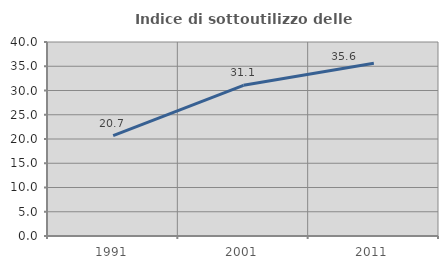
| Category | Indice di sottoutilizzo delle abitazioni  |
|---|---|
| 1991.0 | 20.702 |
| 2001.0 | 31.067 |
| 2011.0 | 35.627 |